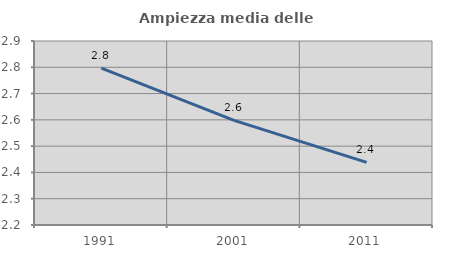
| Category | Ampiezza media delle famiglie |
|---|---|
| 1991.0 | 2.797 |
| 2001.0 | 2.598 |
| 2011.0 | 2.438 |